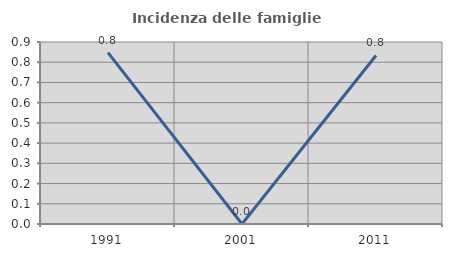
| Category | Incidenza delle famiglie numerose |
|---|---|
| 1991.0 | 0.847 |
| 2001.0 | 0 |
| 2011.0 | 0.833 |